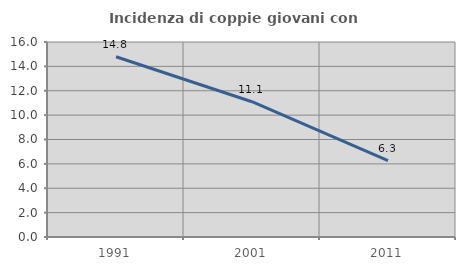
| Category | Incidenza di coppie giovani con figli |
|---|---|
| 1991.0 | 14.79 |
| 2001.0 | 11.098 |
| 2011.0 | 6.276 |